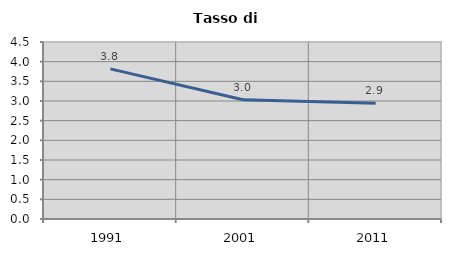
| Category | Tasso di disoccupazione   |
|---|---|
| 1991.0 | 3.817 |
| 2001.0 | 3.03 |
| 2011.0 | 2.941 |